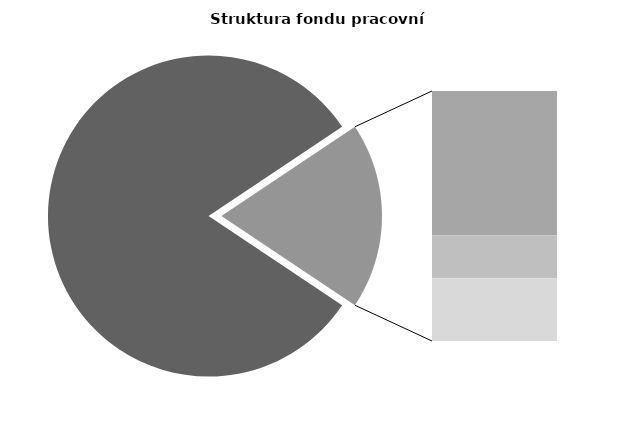
| Category | Series 0 |
|---|---|
| Průměrná měsíční odpracovaná doba bez přesčasu | 139.761 |
| Dovolená | 18.598 |
| Nemoc | 5.567 |
| Jiné | 8.093 |